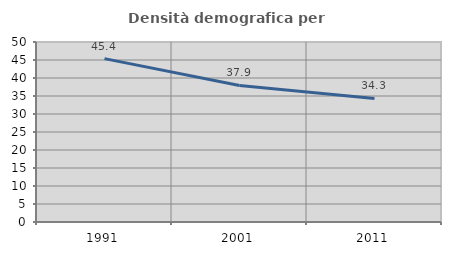
| Category | Densità demografica |
|---|---|
| 1991.0 | 45.38 |
| 2001.0 | 37.926 |
| 2011.0 | 34.322 |